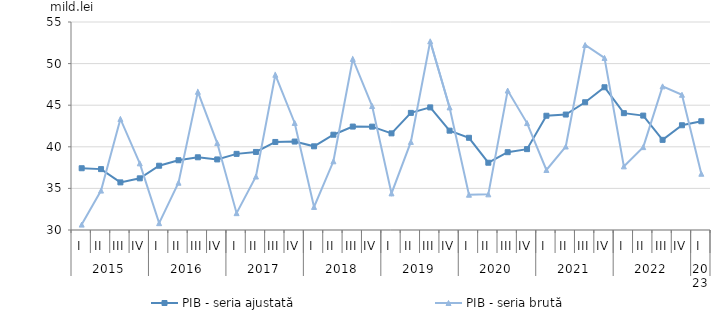
| Category | PIB - seria ajustată | PIB - seria brută |
|---|---|---|
| 0 | 37.423 | 30.647 |
| 1 | 37.318 | 34.736 |
| 2 | 35.723 | 43.347 |
| 3 | 36.21 | 38.011 |
| 4 | 37.725 | 30.82 |
| 5 | 38.385 | 35.681 |
| 6 | 38.74 | 46.605 |
| 7 | 38.482 | 40.451 |
| 8 | 39.151 | 32.024 |
| 9 | 39.382 | 36.429 |
| 10 | 40.582 | 48.654 |
| 11 | 40.631 | 42.863 |
| 12 | 40.058 | 32.776 |
| 13 | 41.454 | 38.257 |
| 14 | 42.431 | 50.555 |
| 15 | 42.423 | 44.902 |
| 16 | 41.614 | 34.401 |
| 17 | 44.077 | 40.587 |
| 18 | 44.736 | 52.682 |
| 19 | 41.939 | 44.734 |
| 20 | 41.083 | 34.239 |
| 21 | 38.086 | 34.285 |
| 22 | 39.351 | 46.761 |
| 23 | 39.719 | 42.851 |
| 24 | 43.734 | 37.212 |
| 25 | 43.878 | 40.034 |
| 26 | 45.356 | 52.235 |
| 27 | 47.156 | 50.682 |
| 28 | 44.042 | 37.647 |
| 29 | 43.75 | 39.962 |
| 30 | 40.836 | 47.265 |
| 31 | 42.589 | 46.254 |
| 32 | 43.072 | 36.76 |